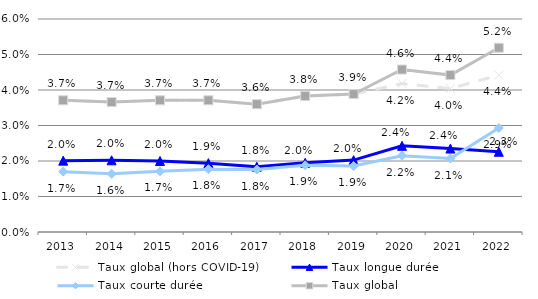
| Category | Taux global (hors COVID-19) | Taux longue durée | Taux courte durée  | Taux global |
|---|---|---|---|---|
| 2013.0 | 0.037 | 0.02 | 0.017 | 0.037 |
| 2014.0 | 0.037 | 0.02 | 0.016 | 0.037 |
| 2015.0 | 0.037 | 0.02 | 0.017 | 0.037 |
| 2016.0 | 0.037 | 0.019 | 0.018 | 0.037 |
| 2017.0 | 0.036 | 0.018 | 0.018 | 0.036 |
| 2018.0 | 0.038 | 0.02 | 0.019 | 0.038 |
| 2019.0 | 0.039 | 0.02 | 0.019 | 0.039 |
| 2020.0 | 0.042 | 0.024 | 0.022 | 0.046 |
| 2021.0 | 0.04 | 0.023 | 0.021 | 0.044 |
| 2022.0 | 0.044 | 0.023 | 0.029 | 0.052 |